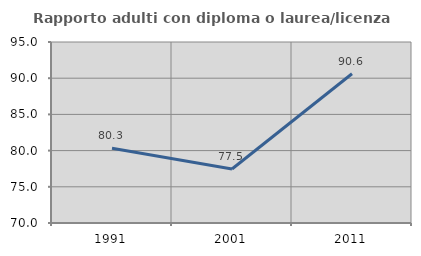
| Category | Rapporto adulti con diploma o laurea/licenza media  |
|---|---|
| 1991.0 | 80.335 |
| 2001.0 | 77.465 |
| 2011.0 | 90.619 |